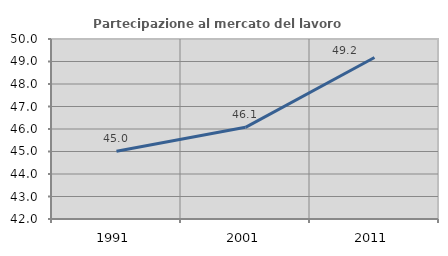
| Category | Partecipazione al mercato del lavoro  femminile |
|---|---|
| 1991.0 | 45.01 |
| 2001.0 | 46.075 |
| 2011.0 | 49.178 |